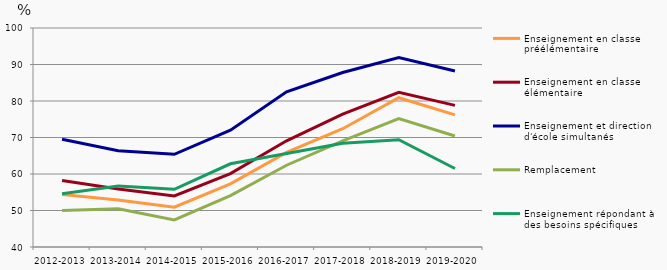
| Category | Enseignement en classe préélémentaire | Enseignement en classe élémentaire | Enseignement et direction d'école simultanés | Remplacement | Enseignement répondant à des besoins spécifiques |
|---|---|---|---|---|---|
| 2012-2013 | 54.4 | 58.2 | 69.5 | 50 | 54.6 |
| 2013-2014 | 52.9 | 55.9 | 66.4 | 50.5 | 56.7 |
| 2014-2015 | 50.9 | 54 | 65.4 | 47.4 | 55.8 |
| 2015-2016 | 57.3 | 60.1 | 72 | 54.1 | 62.8 |
| 2016-2017 | 65.9 | 69.1 | 82.5 | 62.4 | 65.6 |
| 2017-2018 | 72.4 | 76.4 | 87.8 | 69.1 | 68.4 |
| 2018-2019 | 80.9 | 82.4 | 91.9 | 75.2 | 69.4 |
| 2019-2020 | 76.2 | 78.8 | 88.2 | 70.4 | 61.5 |